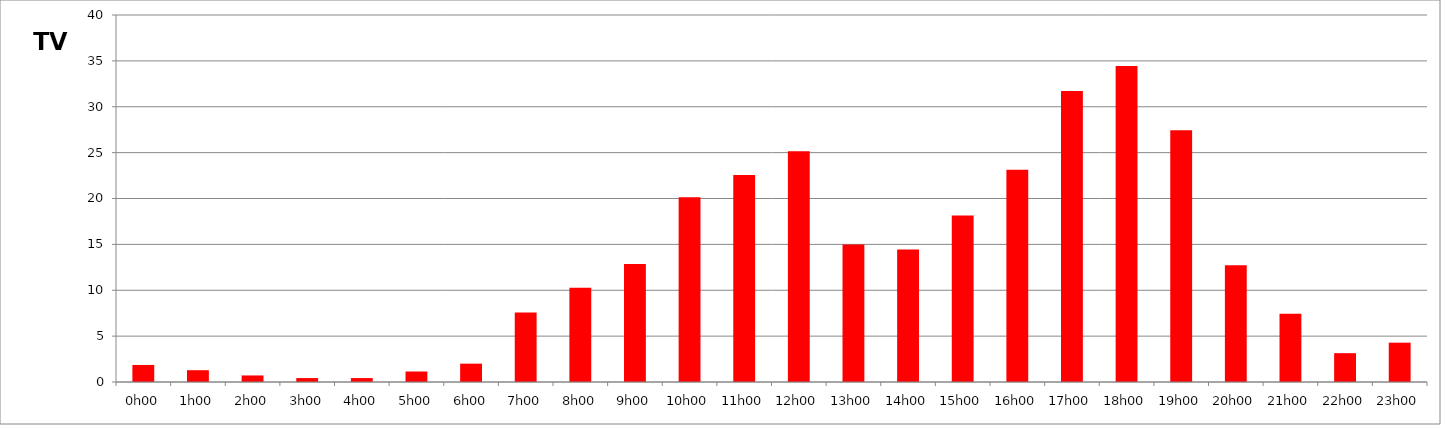
| Category | TV |
|---|---|
| 0.0 | 1.857 |
| 0.041666666666666664 | 1.286 |
| 0.08333333333333333 | 0.714 |
| 0.125 | 0.429 |
| 0.16666666666666666 | 0.429 |
| 0.20833333333333334 | 1.143 |
| 0.25 | 2 |
| 0.2916666666666667 | 7.571 |
| 0.3333333333333333 | 10.286 |
| 0.375 | 12.857 |
| 0.4166666666666667 | 20.143 |
| 0.4583333333333333 | 22.571 |
| 0.5 | 25.143 |
| 0.5416666666666666 | 15 |
| 0.5833333333333334 | 14.429 |
| 0.625 | 18.143 |
| 0.6666666666666666 | 23.143 |
| 0.7083333333333334 | 31.714 |
| 0.75 | 34.429 |
| 0.7916666666666666 | 27.429 |
| 0.8333333333333334 | 12.714 |
| 0.875 | 7.429 |
| 0.9166666666666666 | 3.143 |
| 0.9583333333333334 | 4.286 |